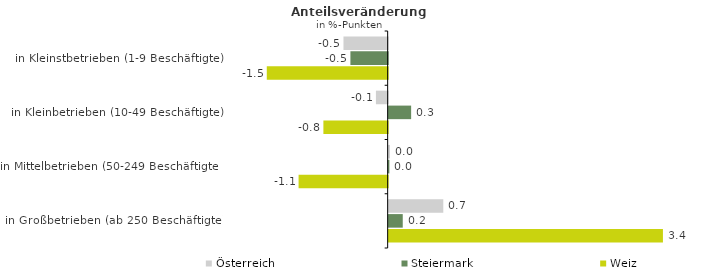
| Category | Österreich | Steiermark | Weiz |
|---|---|---|---|
| in Kleinstbetrieben (1-9 Beschäftigte) | -0.55 | -0.464 | -1.505 |
| in Kleinbetrieben (10-49 Beschäftigte) | -0.146 | 0.28 | -0.8 |
| in Mittelbetrieben (50-249 Beschäftigte) | 0.016 | 0.009 | -1.109 |
| in Großbetrieben (ab 250 Beschäftigte) | 0.68 | 0.175 | 3.414 |